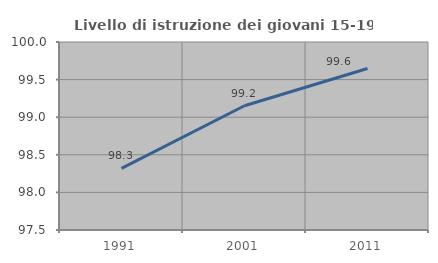
| Category | Livello di istruzione dei giovani 15-19 anni |
|---|---|
| 1991.0 | 98.319 |
| 2001.0 | 99.153 |
| 2011.0 | 99.648 |